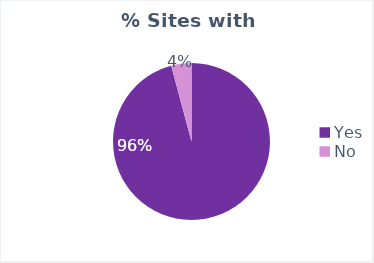
| Category | Central Rakhine |
|---|---|
| Yes | 0.958 |
| No | 0.042 |